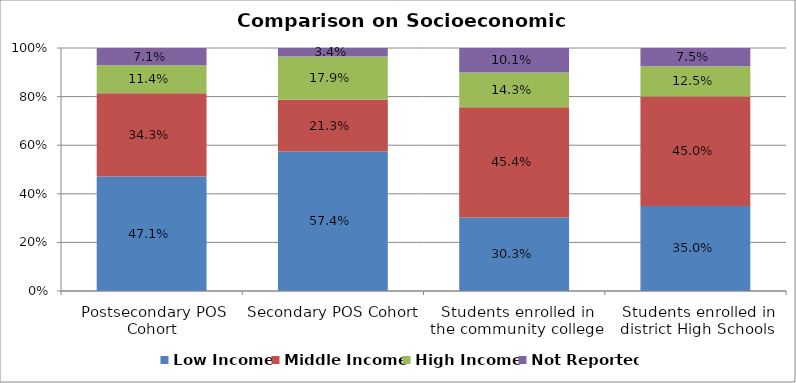
| Category | Low Income | Middle Income | High Income | Not Reported |
|---|---|---|---|---|
| Postsecondary POS Cohort | 0.471 | 0.343 | 0.114 | 0.071 |
| Secondary POS Cohort | 0.574 | 0.213 | 0.179 | 0.034 |
| Students enrolled in the community college | 0.303 | 0.454 | 0.143 | 0.101 |
| Students enrolled in district High Schools | 0.35 | 0.45 | 0.125 | 0.075 |